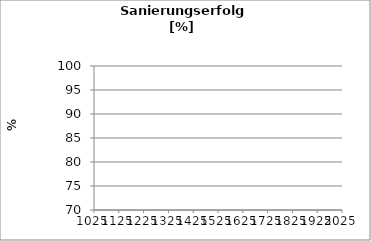
| Category | Series 1 |
|---|---|
| 2002.0 | 0 |
| 2003.0 | 0 |
| 2004.0 | 0 |
| 2005.0 | 0 |
| 2006.0 | 0 |
| 2007.0 | 0 |
| 2008.0 | 0 |
| 2009.0 | 0 |
| 2010.0 | 0 |
| 2011.0 | 0 |
| 2012.0 | 0 |
| 2013.0 | 0 |
| 2014.0 | 0 |
| 2015.0 | 0 |
| 2016.0 | 0 |
| 2017.0 | 0 |
| 2018.0 | 0 |
| 2019.0 | 0 |
| 2020.0 | 0 |
| 2021.0 | 0 |
| 2022.0 | 0 |
| 2023.0 | 0 |
| 2024.0 | 0 |